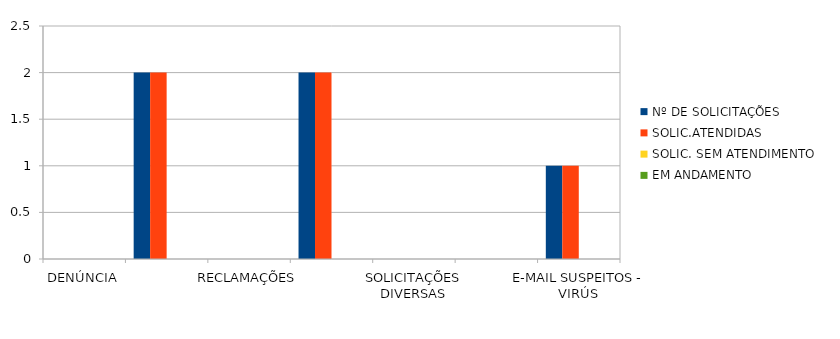
| Category | Nº DE SOLICITAÇÕES | SOLIC.ATENDIDAS | SOLIC. SEM ATENDIMENTO | EM ANDAMENTO |
|---|---|---|---|---|
| DENÚNCIA | 0 | 0 | 0 | 0 |
| DÚVIDA | 2 | 2 | 0 | 0 |
| RECLAMAÇÕES | 0 | 0 | 0 | 0 |
| PEDIDO DE ACESSO À INFORMAÇÃO | 2 | 2 | 0 | 0 |
| SOLICITAÇÕES DIVERSAS | 0 | 0 | 0 | 0 |
| SUGESTÃO  | 0 | 0 | 0 | 0 |
| E-MAIL SUSPEITOS - VIRÚS | 1 | 1 | 0 | 0 |